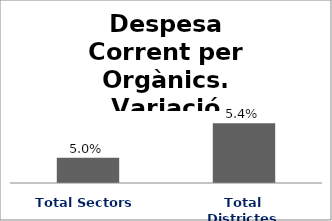
| Category | Series 0 |
|---|---|
| Total Sectors | 0.05 |
| Total Districtes | 0.054 |